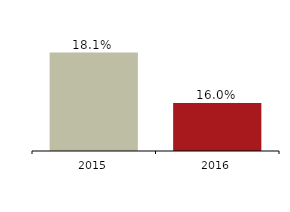
| Category | Leverage ratio |
|---|---|
| 2016.0 | 0.16 |
| 2015.0 | 0.181 |